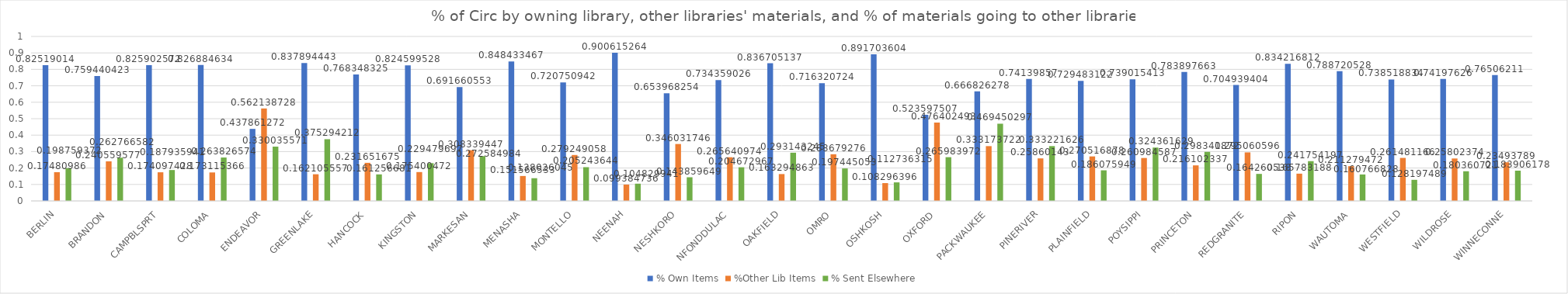
| Category | % Own Items | %Other Lib Items | % Sent Elsewhere |
|---|---|---|---|
| BERLIN | 0.825 | 0.175 | 0.199 |
| BRANDON | 0.759 | 0.241 | 0.263 |
| CAMPBLSPRT | 0.826 | 0.174 | 0.188 |
| COLOMA | 0.827 | 0.173 | 0.264 |
| ENDEAVOR | 0.438 | 0.562 | 0.33 |
| GREENLAKE | 0.838 | 0.162 | 0.375 |
| HANCOCK | 0.768 | 0.232 | 0.161 |
| KINGSTON | 0.825 | 0.175 | 0.229 |
| MARKESAN | 0.692 | 0.308 | 0.273 |
| MENASHA | 0.848 | 0.152 | 0.138 |
| MONTELLO | 0.721 | 0.279 | 0.205 |
| NEENAH | 0.901 | 0.099 | 0.105 |
| NESHKORO | 0.654 | 0.346 | 0.144 |
| NFONDDULAC | 0.734 | 0.266 | 0.205 |
| OAKFIELD | 0.837 | 0.163 | 0.293 |
| OMRO | 0.716 | 0.284 | 0.197 |
| OSHKOSH | 0.892 | 0.108 | 0.113 |
| OXFORD | 0.524 | 0.476 | 0.266 |
| PACKWAUKEE | 0.667 | 0.333 | 0.469 |
| PINERIVER | 0.741 | 0.259 | 0.333 |
| PLAINFIELD | 0.729 | 0.271 | 0.186 |
| POYSIPPI | 0.739 | 0.261 | 0.324 |
| PRINCETON | 0.784 | 0.216 | 0.298 |
| REDGRANITE | 0.705 | 0.295 | 0.164 |
| RIPON | 0.834 | 0.166 | 0.242 |
| WAUTOMA | 0.789 | 0.211 | 0.161 |
| WESTFIELD | 0.739 | 0.261 | 0.128 |
| WILDROSE | 0.742 | 0.258 | 0.18 |
| WINNECONNE | 0.765 | 0.235 | 0.184 |